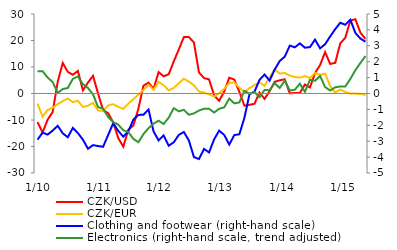
| Category | CZK/USD | CZK/EUR |
|---|---|---|
|  1/10 | -10.819 | -3.803 |
| 2 | -14.734 | -8.722 |
| 3 | -9.884 | -6.202 |
| 4 | -6.995 | -5.408 |
| 5 | 4.415 | -4.01 |
| 6 | 11.518 | -2.883 |
| 7 | 8.178 | -1.868 |
| 8 | 7.054 | -3.28 |
| 9 | 8.533 | -2.752 |
| 10 | 1.183 | -5.072 |
| 11 | 4.148 | -4.609 |
| 12 | 6.662 | -3.494 |
|  1/11 | -0.03 | -6.453 |
| 2 | -6.295 | -6.545 |
| 3 | -7.426 | -4.496 |
| 4 | -10.894 | -4.036 |
| 5 | -16.816 | -4.999 |
| 6 | -20.074 | -5.8 |
| 7 | -13.691 | -3.811 |
| 8 | -12.066 | -2.155 |
| 9 | -5.648 | -0.382 |
| 10 | 2.958 | 1.313 |
| 11 | 4.114 | 3.314 |
| 12 | 1.772 | 1.39 |
|  1/12 | 8.082 | 4.428 |
| 2 | 6.478 | 3.151 |
| 3 | 7.28 | 1.163 |
| 4 | 12.081 | 2.09 |
| 5 | 16.622 | 3.851 |
| 6 | 21.271 | 5.583 |
| 7 | 21.302 | 4.49 |
| 8 | 19.252 | 3.081 |
| 9 | 7.922 | 0.709 |
| 10 | 5.82 | 0.363 |
| 11 | 5.323 | -0.346 |
| 12 | -0.697 | -1.17 |
|  1/13 | -2.775 | 0.122 |
| 2 | 0.711 | 1.738 |
| 3 | 5.955 | 3.996 |
| 4 | 5.242 | 4.199 |
| 5 | 0.658 | 2.242 |
| 6 | -4.582 | 0.467 |
| 7 | -4.295 | 2.025 |
| 8 | -3.867 | 3.187 |
| 9 | 0.387 | 4.269 |
| 10 | -2.047 | 2.887 |
| 11 | 0.91 | 6.151 |
| 12 | 4.413 | 9.124 |
|   1/14 | 4.979 | 7.516 |
| 2 | 5.353 | 7.718 |
| 3 | 0.061 | 6.748 |
| 4 | 0.189 | 6.23 |
| 5 | 0.223 | 5.989 |
| 6 | 3.397 | 6.561 |
| 7 | 2.282 | 5.812 |
| 8 | 7.684 | 7.74 |
| 9 | 10.727 | 7.021 |
| 10 | 15.627 | 7.489 |
| 11 | 11.162 | 2.749 |
| 12 | 11.56 | 0.424 |
|   1/15 | 18.9 | 1.496 |
| 2 | 21.051 | 0.604 |
| 3 | 27.504 | -0.054 |
| 4 | 28.034 | -0.025 |
| 5 | 22.92 | -0.161 |
| 6 | 20.599 | -0.528 |